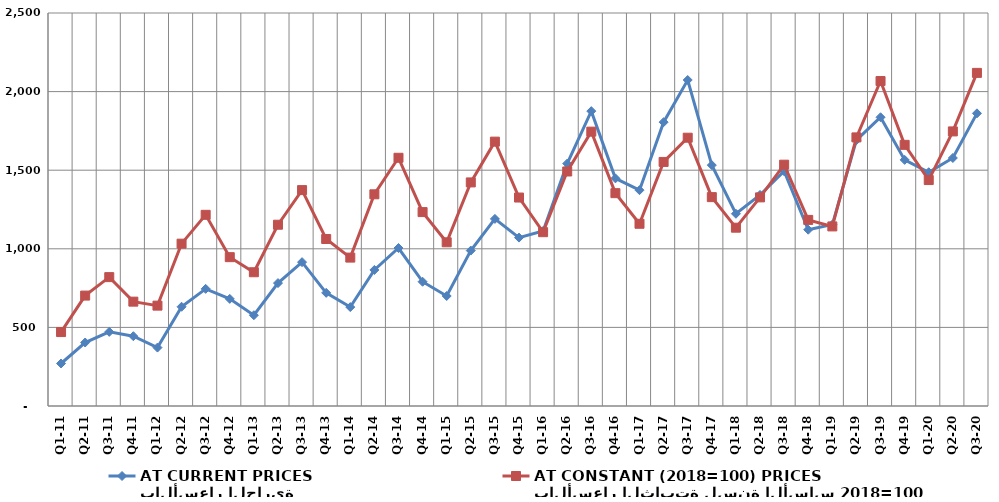
| Category | بالأسعار الجارية
AT CURRENT PRICES | بالأسعار الثابتة لسنة الأساس 2018=100
AT CONSTANT (2018=100) PRICES |
|---|---|---|
| Q1-11 | 270.384 | 470.414 |
| Q2-11 | 403.897 | 702.384 |
| Q3-11 | 471.683 | 819.72 |
| Q4-11 | 443.955 | 663.835 |
| Q1-12 | 371.671 | 638.46 |
| Q2-12 | 631.249 | 1032.679 |
| Q3-12 | 745.25 | 1216.155 |
| Q4-12 | 681.42 | 946.769 |
| Q1-13 | 577.543 | 850.896 |
| Q2-13 | 781.932 | 1153.154 |
| Q3-13 | 914.97 | 1373.41 |
| Q4-13 | 719.83 | 1062.376 |
| Q1-14 | 629.251 | 944.036 |
| Q2-14 | 865.365 | 1346.702 |
| Q3-14 | 1005.055 | 1579.084 |
| Q4-14 | 790.431 | 1233.508 |
| Q1-15 | 699.678 | 1041.401 |
| Q2-15 | 988.76 | 1422.307 |
| Q3-15 | 1190.238 | 1681.743 |
| Q4-15 | 1071.369 | 1326.127 |
| Q1-16 | 1113.591 | 1105.709 |
| Q2-16 | 1542.033 | 1491.766 |
| Q3-16 | 1875.733 | 1745.261 |
| Q4-16 | 1447.989 | 1353.945 |
| Q1-17 | 1373.048 | 1159.164 |
| Q2-17 | 1805.712 | 1552.585 |
| Q3-17 | 2073.806 | 1706.697 |
| Q4-17 | 1532.286 | 1328.688 |
| Q1-18 | 1222.932 | 1134.294 |
| Q2-18 | 1342.587 | 1327.077 |
| Q3-18 | 1493.412 | 1535.122 |
| Q4-18 | 1121.434 | 1183.871 |
| Q1-19 | 1154.126 | 1142.356 |
| Q2-19 | 1691.104 | 1708.672 |
| Q3-19 | 1836.739 | 2067.224 |
| Q4-19 | 1565.69 | 1661.247 |
| Q1-20 | 1487.021 | 1437.351 |
| Q2-20 | 1577.707 | 1746.699 |
| Q3-20 | 1861.688 | 2119.084 |